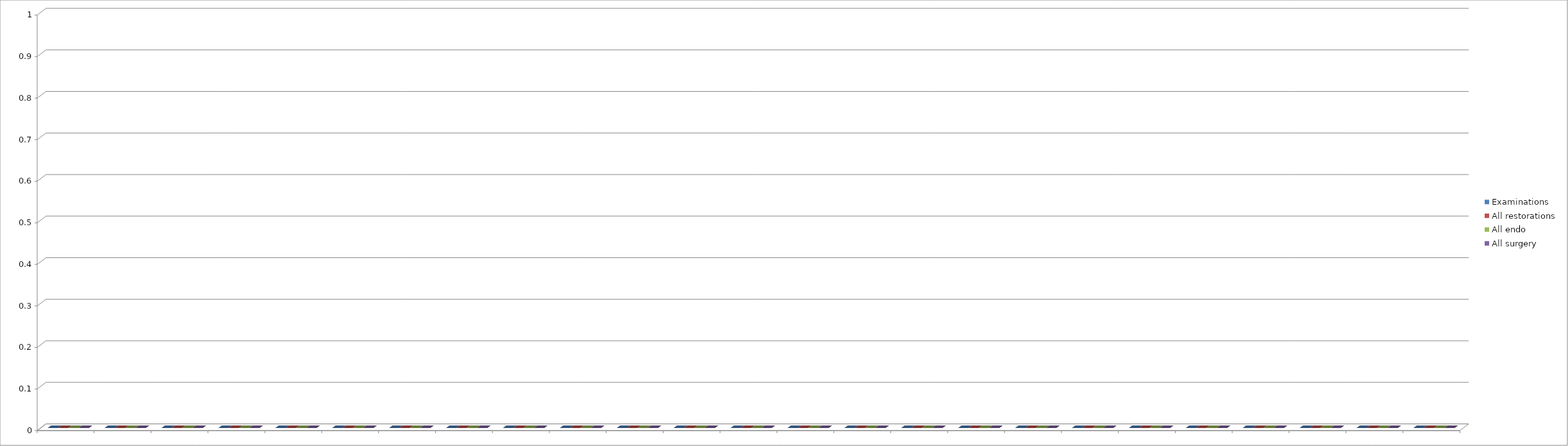
| Category | Examinations | All restorations | All endo | All surgery |
|---|---|---|---|---|
| 0 | 0 | 0 | 0 | 0 |
| 1 | 0 | 0 | 0 | 0 |
| 2 | 0 | 0 | 0 | 0 |
| 3 | 0 | 0 | 0 | 0 |
| 4 | 0 | 0 | 0 | 0 |
| 5 | 0 | 0 | 0 | 0 |
| 6 | 0 | 0 | 0 | 0 |
| 7 | 0 | 0 | 0 | 0 |
| 8 | 0 | 0 | 0 | 0 |
| 9 | 0 | 0 | 0 | 0 |
| 10 | 0 | 0 | 0 | 0 |
| 11 | 0 | 0 | 0 | 0 |
| 12 | 0 | 0 | 0 | 0 |
| 13 | 0 | 0 | 0 | 0 |
| 14 | 0 | 0 | 0 | 0 |
| 15 | 0 | 0 | 0 | 0 |
| 16 | 0 | 0 | 0 | 0 |
| 17 | 0 | 0 | 0 | 0 |
| 18 | 0 | 0 | 0 | 0 |
| 19 | 0 | 0 | 0 | 0 |
| 20 | 0 | 0 | 0 | 0 |
| 21 | 0 | 0 | 0 | 0 |
| 22 | 0 | 0 | 0 | 0 |
| 23 | 0 | 0 | 0 | 0 |
| 24 | 0 | 0 | 0 | 0 |